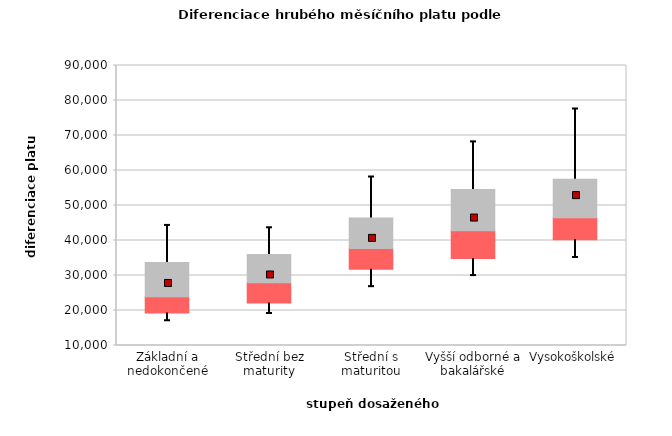
| Category | 0.25 | 0.5 | 0.75 |
|---|---|---|---|
| Základní a nedokončené | 19308.699 | 4624.52 | 9799.657 |
| Střední bez maturity | 22120.921 | 5819.412 | 8064.865 |
| Střední s maturitou | 31757.044 | 5929.003 | 8765.101 |
| Vyšší odborné a bakalářské | 34862.888 | 7894.931 | 11798.284 |
| Vysokoškolské | 40249.409 | 6234.596 | 11049.482 |